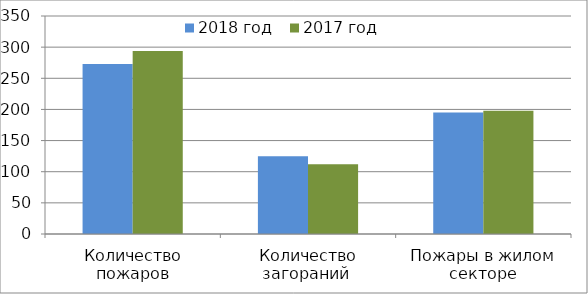
| Category | 2018 год | 2017 год |
|---|---|---|
| Количество пожаров | 273 | 294 |
| Количество загораний  | 125 | 112 |
| Пожары в жилом секторе | 195 | 198 |